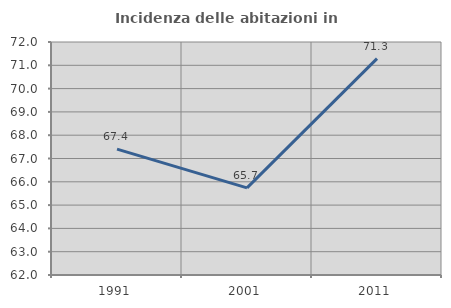
| Category | Incidenza delle abitazioni in proprietà  |
|---|---|
| 1991.0 | 67.403 |
| 2001.0 | 65.739 |
| 2011.0 | 71.287 |